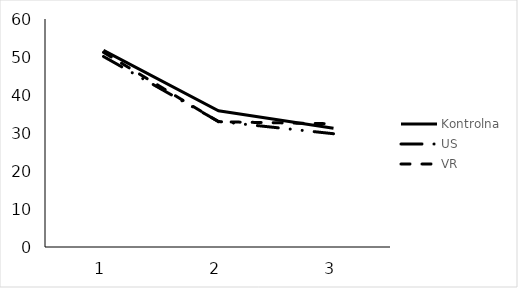
| Category | Kontrolna | US | VR |
|---|---|---|---|
| 0 | 51.76 | 50.13 | 51.23 |
| 1 | 35.85 | 33.04 | 32.96 |
| 2 | 31.26 | 29.81 | 32.42 |